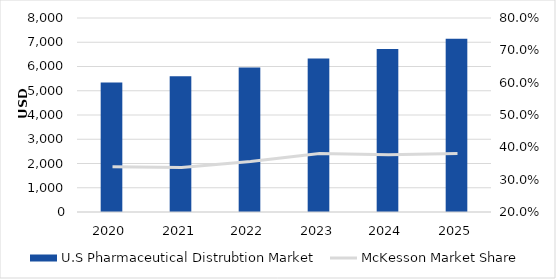
| Category | U.S Pharmaceutical Distrubtion Market |
|---|---|
| 2020.0 | 534411.765 |
| 2021.0 | 559982.249 |
| 2022.0 | 595924.157 |
| 2023.0 | 632865.449 |
| 2024.0 | 672198.792 |
| 2025.0 | 714362.064 |